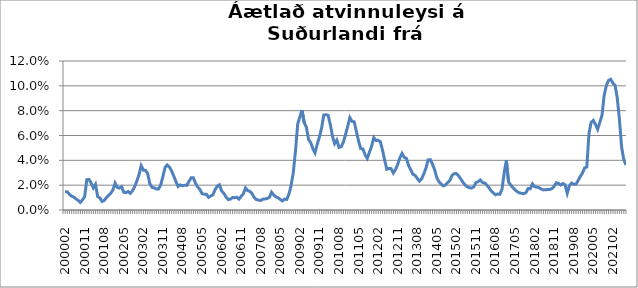
| Category | Series 0 |
|---|---|
| 200002 | 0.015 |
| 200003 | 0.015 |
| 200004 | 0.013 |
| 200005 | 0.011 |
| 200006 | 0.01 |
| 200007 | 0.009 |
| 200008 | 0.008 |
| 200009 | 0.006 |
| 200010 | 0.008 |
| 200011 | 0.011 |
| 200012 | 0.024 |
| 200101 | 0.025 |
| 200102 | 0.022 |
| 200103 | 0.018 |
| 200104 | 0.021 |
| 200105 | 0.011 |
| 200106 | 0.01 |
| 200107 | 0.007 |
| 200108 | 0.008 |
| 200109 | 0.01 |
| 200110 | 0.012 |
| 200111 | 0.014 |
| 200112 | 0.016 |
| 200201 | 0.022 |
| 200202 | 0.018 |
| 200203 | 0.018 |
| 200204 | 0.019 |
| 200205 | 0.014 |
| 200206 | 0.014 |
| 200207 | 0.015 |
| 200208 | 0.013 |
| 200209 | 0.015 |
| 200210 | 0.019 |
| 200211 | 0.023 |
| 200212 | 0.029 |
| 200301 | 0.036 |
| 200302 | 0.032 |
| 200303 | 0.032 |
| 200304 | 0.029 |
| 200305 | 0.021 |
| 200306 | 0.018 |
| 200307 | 0.018 |
| 200308 | 0.017 |
| 200309 | 0.017 |
| 200310 | 0.02 |
| 200311 | 0.027 |
| 200312 | 0.034 |
| 200401 | 0.036 |
| 200402 | 0.035 |
| 200403 | 0.031 |
| 200404 | 0.027 |
| 200405 | 0.023 |
| 200406 | 0.019 |
| 200407 | 0.02 |
| 200408 | 0.019 |
| 200409 | 0.02 |
| 200410 | 0.02 |
| 200411 | 0.023 |
| 200412 | 0.026 |
| 200501 | 0.026 |
| 200502 | 0.022 |
| 200503 | 0.018 |
| 200504 | 0.017 |
| 200505 | 0.013 |
| 200506 | 0.013 |
| 200507 | 0.013 |
| 200508 | 0.01 |
| 200509 | 0.011 |
| 200510 | 0.012 |
| 200511 | 0.016 |
| 200512 | 0.019 |
| 200601 | 0.02 |
| 200602 | 0.015 |
| 200603 | 0.013 |
| 200604 | 0.011 |
| 200605 | 0.008 |
| 200606 | 0.009 |
| 200607 | 0.01 |
| 200608 | 0.01 |
| 200609 | 0.01 |
| 200610 | 0.009 |
| 200611 | 0.011 |
| 200612 | 0.013 |
| 200701 | 0.018 |
| 200702 | 0.016 |
| 200703 | 0.015 |
| 200704 | 0.013 |
| 200705 | 0.01 |
| 200706 | 0.008 |
| 200707 | 0.008 |
| 200708 | 0.008 |
| 200709 | 0.009 |
| 200710 | 0.009 |
| 200711 | 0.009 |
| 200712 | 0.01 |
| 200801 | 0.014 |
| 200802 | 0.012 |
| 200803 | 0.011 |
| 200804 | 0.01 |
| 200805 | 0.008 |
| 200806 | 0.007 |
| 200807 | 0.009 |
| 200808 | 0.008 |
| 200809 | 0.013 |
| 200810 | 0.02 |
| 200811 | 0.03 |
| 200812 | 0.048 |
| 200901 | 0.069 |
| 200902 | 0.075 |
| 200903 | 0.08 |
| 200904 | 0.07 |
| 200905 | 0.067 |
| 200906 | 0.057 |
| 200907 | 0.054 |
| 200908 | 0.049 |
| 200909 | 0.046 |
| 200910 | 0.053 |
| 200911 | 0.059 |
| 200912 | 0.066 |
| 201001 | 0.077 |
| 201002 | 0.077 |
| 201003 | 0.076 |
| 201004 | 0.069 |
| 201005 | 0.059 |
| 201006 | 0.053 |
| 201007 | 0.056 |
| 201008 | 0.05 |
| 201009 | 0.051 |
| 201010 | 0.054 |
| 201011 | 0.061 |
| 201012 | 0.067 |
| 201101 | 0.074 |
| 201102 | 0.071 |
| 201103 | 0.071 |
| 201104 | 0.063 |
| 201105 | 0.056 |
| 201106 | 0.049 |
| 201107 | 0.049 |
| 201108 | 0.044 |
| 201109 | 0.042 |
| 201110 | 0.046 |
| 201111 | 0.051 |
| 201112 | 0.058 |
| 201201 | 0.056 |
| 201202 | 0.056 |
| 201203 | 0.055 |
| 201204 | 0.048 |
| 201205 | 0.04 |
| 201206 | 0.033 |
| 201207 | 0.033 |
| 201208 | 0.033 |
| 201209 | 0.03 |
| 201210 | 0.033 |
| 201211 | 0.037 |
| 201212 | 0.042 |
| 201301 | 0.046 |
| 201302 | 0.042 |
| 201303 | 0.042 |
| 201304 | 0.036 |
| 201305 | 0.032 |
| 201306 | 0.029 |
| 201307 | 0.028 |
| 201308 | 0.025 |
| 201309 | 0.023 |
| 201310 | 0.025 |
| 201311 | 0.029 |
| 201312 | 0.034 |
| 201401 | 0.04 |
| 201402 | 0.041 |
| 201403 | 0.037 |
| 201404 | 0.032 |
| 201405 | 0.026 |
| 201406 | 0.023 |
| 201407 | 0.021 |
| 201408 | 0.019 |
| 201409 | 0.02 |
| 201410 | 0.022 |
| 201411 | 0.024 |
| 201412 | 0.028 |
| 201501 | 0.029 |
| 201502 | 0.029 |
| 201503 | 0.028 |
| 201504 | 0.025 |
| 201505 | 0.022 |
| 201506 | 0.02 |
| 201507 | 0.019 |
| 201508 | 0.018 |
| 201509 | 0.018 |
| 201510 | 0.019 |
| 201511 | 0.022 |
| 201512 | 0.023 |
| 201601 | 0.024 |
| 201602 | 0.022 |
| 201603 | 0.022 |
| 201604 | 0.02 |
| 201605 | 0.018 |
| 201606 | 0.015 |
| 201607 | 0.014 |
| 201608 | 0.012 |
| 201609 | 0.013 |
| 201610 | 0.013 |
| 201611 | 0.017 |
| 201612 | 0.03 |
| 201701 | 0.04 |
| 201702 | 0.023 |
| 201703 | 0.02 |
| 201704 | 0.018 |
| 201705 | 0.016 |
| 201706 | 0.015 |
| 201707 | 0.014 |
| 201708 | 0.014 |
| 201709 | 0.013 |
| 201710 | 0.014 |
| 201711 | 0.017 |
| 201712 | 0.017 |
| 201801 | 0.021 |
| 201802 | 0.019 |
| 201803 | 0.018 |
| 201804 | 0.018 |
| 201805 | 0.017 |
| 201806 | 0.016 |
| 201807 | 0.016 |
| 201808 | 0.017 |
| 201809 | 0.017 |
| 201810 | 0.017 |
| 201811 | 0.019 |
| 201812 | 0.022 |
| 201901 | 0.021 |
| 201902 | 0.02 |
| 201903 | 0.021 |
| 201904 | 0.02 |
| 201905 | 0.013 |
| 201906 | 0.02 |
| 201907 | 0.022 |
| 201908 | 0.021 |
| 201909 | 0.021 |
| 201910 | 0.024 |
| 201911 | 0.027 |
| 201912 | 0.03 |
| 202001(a) | 0.034 |
| 202002 | 0.035 |
| 202003***  | 0.061 |
| 202004 | 0.071 |
| 202005 | 0.072 |
| 202006 | 0.069 |
| 202007 | 0.065 |
| 202008 | 0.071 |
| 202009 | 0.076 |
| 202010 | 0.092 |
| 202011 | 0.1 |
| 202012 | 0.104 |
| 202101 | 0.105 |
| 202102 | 0.102 |
| 202103 | 0.101 |
| 202104 | 0.09 |
| 202105 | 0.073 |
| 202106 | 0.051 |
| 202107 | 0.041 |
| 202108 | 0.036 |